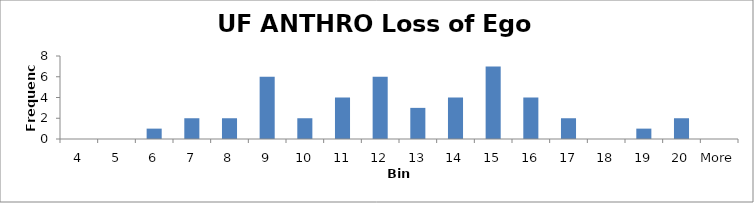
| Category | Frequency |
|---|---|
| 4 | 0 |
| 5 | 0 |
| 6 | 1 |
| 7 | 2 |
| 8 | 2 |
| 9 | 6 |
| 10 | 2 |
| 11 | 4 |
| 12 | 6 |
| 13 | 3 |
| 14 | 4 |
| 15 | 7 |
| 16 | 4 |
| 17 | 2 |
| 18 | 0 |
| 19 | 1 |
| 20 | 2 |
| More | 0 |